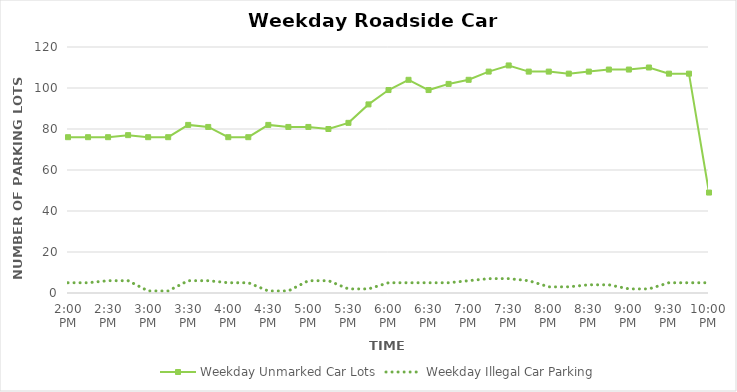
| Category | Weekday Unmarked Car Lots | Weekday Illegal Car Parking |
|---|---|---|
| 0.5833333333333334 | 76 | 5 |
| 0.59375 | 76 | 5 |
| 0.604166666666667 | 76 | 6 |
| 0.614583333333334 | 77 | 6 |
| 0.625 | 76 | 1 |
| 0.635416666666667 | 76 | 1 |
| 0.645833333333334 | 82 | 6 |
| 0.656250000000001 | 81 | 6 |
| 0.666666666666667 | 76 | 5 |
| 0.677083333333334 | 76 | 5 |
| 0.687500000000001 | 82 | 1 |
| 0.697916666666668 | 81 | 1 |
| 0.708333333333335 | 81 | 6 |
| 0.718750000000001 | 80 | 6 |
| 0.729166666666668 | 83 | 2 |
| 0.739583333333335 | 92 | 2 |
| 0.750000000000002 | 99 | 5 |
| 0.760416666666668 | 104 | 5 |
| 0.770833333333335 | 99 | 5 |
| 0.781250000000002 | 102 | 5 |
| 0.791666666666669 | 104 | 6 |
| 0.802083333333335 | 108 | 7 |
| 0.812500000000002 | 111 | 7 |
| 0.822916666666669 | 108 | 6 |
| 0.833333333333336 | 108 | 3 |
| 0.843750000000002 | 107 | 3 |
| 0.854166666666669 | 108 | 4 |
| 0.864583333333336 | 109 | 4 |
| 0.875000000000002 | 109 | 2 |
| 0.885416666666669 | 110 | 2 |
| 0.895833333333336 | 107 | 5 |
| 0.906250000000003 | 107 | 5 |
| 0.916666666666669 | 49 | 5 |